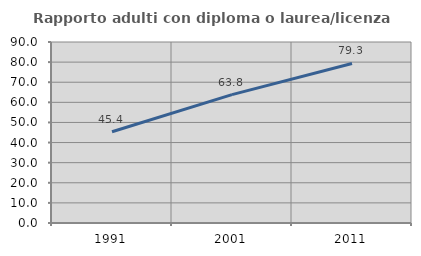
| Category | Rapporto adulti con diploma o laurea/licenza media  |
|---|---|
| 1991.0 | 45.384 |
| 2001.0 | 63.811 |
| 2011.0 | 79.332 |